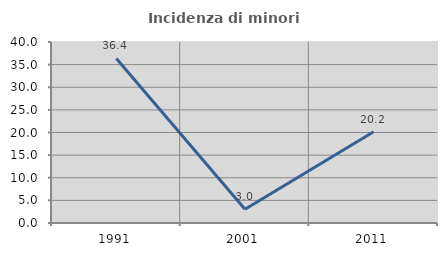
| Category | Incidenza di minori stranieri |
|---|---|
| 1991.0 | 36.364 |
| 2001.0 | 3.03 |
| 2011.0 | 20.163 |